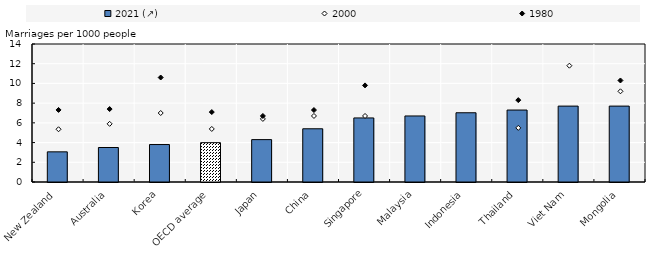
| Category | 2021 (↗) |
|---|---|
| New Zealand | 3.06 |
| Australia | 3.5 |
| Korea | 3.8 |
| OECD average | 3.991 |
| Japan | 4.3 |
| China | 5.4 |
| Singapore | 6.5 |
| Malaysia | 6.7 |
| Indonesia | 7.024 |
| Thailand | 7.3 |
| Viet Nam | 7.7 |
| Mongolia | 7.7 |